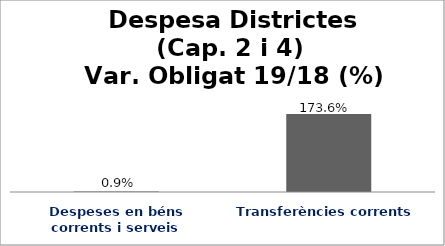
| Category | Series 0 |
|---|---|
| Despeses en béns corrents i serveis | 0.009 |
| Transferències corrents | 1.736 |